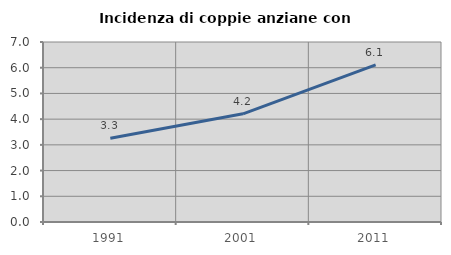
| Category | Incidenza di coppie anziane con figli |
|---|---|
| 1991.0 | 3.258 |
| 2001.0 | 4.207 |
| 2011.0 | 6.11 |